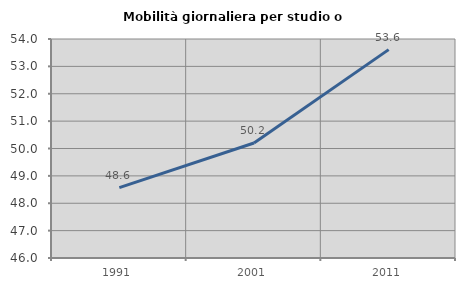
| Category | Mobilità giornaliera per studio o lavoro |
|---|---|
| 1991.0 | 48.568 |
| 2001.0 | 50.199 |
| 2011.0 | 53.612 |